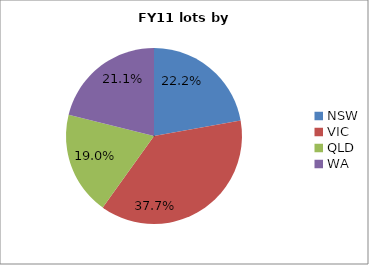
| Category | Series 0 |
|---|---|
| NSW | 0.222 |
| VIC | 0.377 |
| QLD | 0.19 |
| WA | 0.211 |